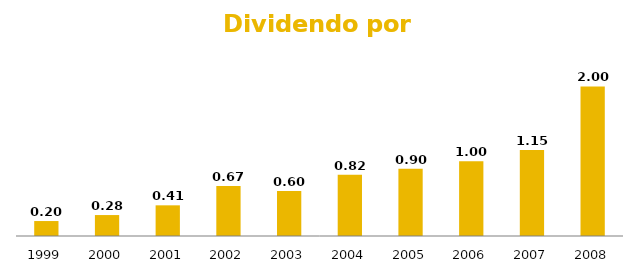
| Category | Dividendos Grupo Ferrovial 1999-2008 |
|---|---|
| 2008.0 | 2 |
| 2007.0 | 1.15 |
| 2006.0 | 1 |
| 2005.0 | 0.9 |
| 2004.0 | 0.82 |
| 2003.0 | 0.6 |
| 2002.0 | 0.67 |
| 2001.0 | 0.41 |
| 2000.0 | 0.28 |
| 1999.0 | 0.2 |